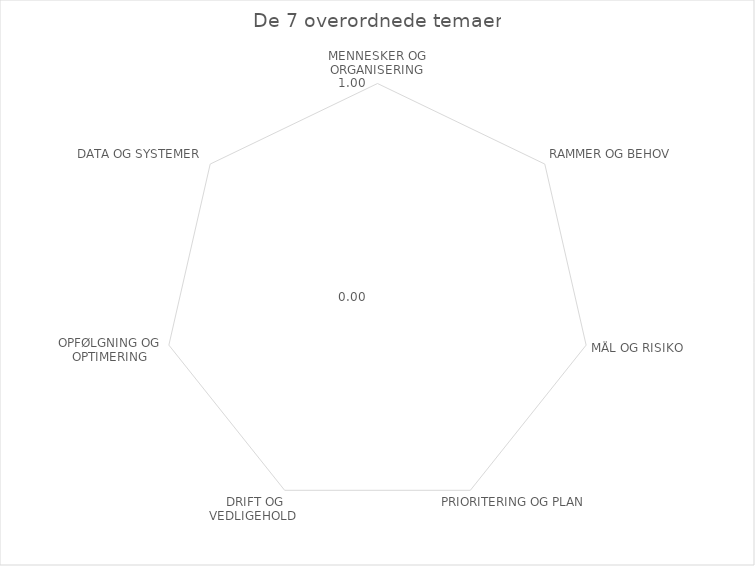
| Category | Series 0 |
|---|---|
| MENNESKER OG ORGANISERING | 0 |
| RAMMER OG BEHOV | 0 |
| MÅL OG RISIKO | 0 |
| PRIORITERING OG PLAN | 0 |
| DRIFT OG VEDLIGEHOLD  | 0 |
| OPFØLGNING OG OPTIMERING | 0 |
| DATA OG SYSTEMER | 0 |